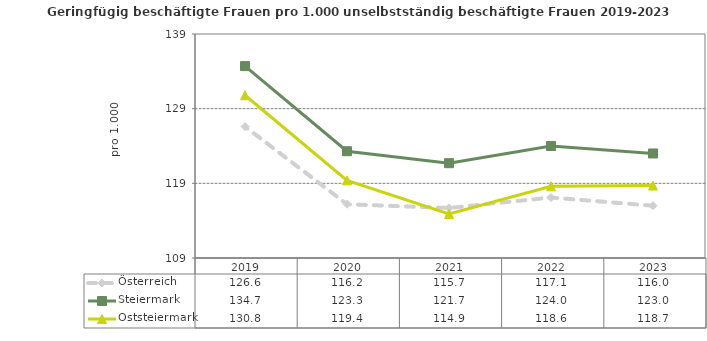
| Category | Österreich | Steiermark | Oststeiermark |
|---|---|---|---|
| 2023.0 | 116 | 123 | 118.7 |
| 2022.0 | 117.1 | 124 | 118.6 |
| 2021.0 | 115.7 | 121.7 | 114.9 |
| 2020.0 | 116.2 | 123.3 | 119.4 |
| 2019.0 | 126.6 | 134.7 | 130.8 |